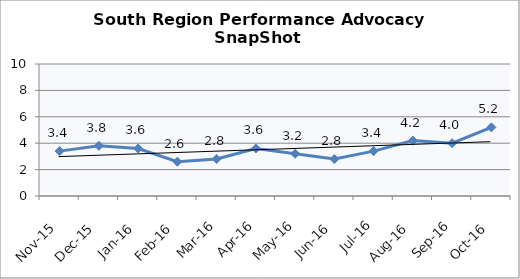
| Category | South Region |
|---|---|
| Nov-15 | 3.4 |
| Dec-15 | 3.8 |
| Jan-16 | 3.6 |
| Feb-16 | 2.6 |
| Mar-16 | 2.8 |
| Apr-16 | 3.6 |
| May-16 | 3.2 |
| Jun-16 | 2.8 |
| Jul-16 | 3.4 |
| Aug-16 | 4.2 |
| Sep-16 | 4 |
| Oct-16 | 5.2 |